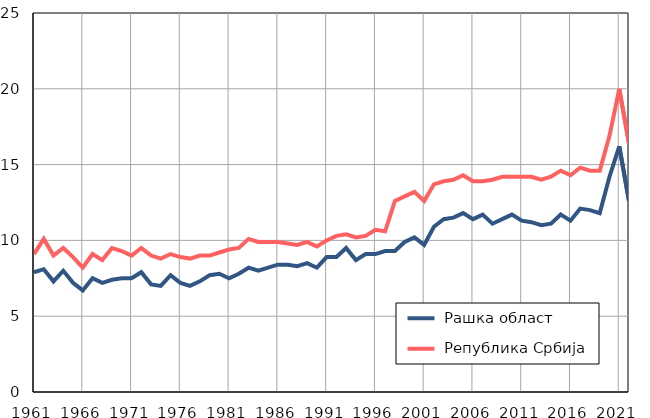
| Category |  Рашка област |  Република Србија |
|---|---|---|
| 1961.0 | 7.9 | 9.1 |
| 1962.0 | 8.1 | 10.1 |
| 1963.0 | 7.3 | 9 |
| 1964.0 | 8 | 9.5 |
| 1965.0 | 7.2 | 8.9 |
| 1966.0 | 6.7 | 8.2 |
| 1967.0 | 7.5 | 9.1 |
| 1968.0 | 7.2 | 8.7 |
| 1969.0 | 7.4 | 9.5 |
| 1970.0 | 7.5 | 9.3 |
| 1971.0 | 7.5 | 9 |
| 1972.0 | 7.9 | 9.5 |
| 1973.0 | 7.1 | 9 |
| 1974.0 | 7 | 8.8 |
| 1975.0 | 7.7 | 9.1 |
| 1976.0 | 7.2 | 8.9 |
| 1977.0 | 7 | 8.8 |
| 1978.0 | 7.3 | 9 |
| 1979.0 | 7.7 | 9 |
| 1980.0 | 7.8 | 9.2 |
| 1981.0 | 7.5 | 9.4 |
| 1982.0 | 7.8 | 9.5 |
| 1983.0 | 8.2 | 10.1 |
| 1984.0 | 8 | 9.9 |
| 1985.0 | 8.2 | 9.9 |
| 1986.0 | 8.4 | 9.9 |
| 1987.0 | 8.4 | 9.8 |
| 1988.0 | 8.3 | 9.7 |
| 1989.0 | 8.5 | 9.9 |
| 1990.0 | 8.2 | 9.6 |
| 1991.0 | 8.9 | 10 |
| 1992.0 | 8.9 | 10.3 |
| 1993.0 | 9.5 | 10.4 |
| 1994.0 | 8.7 | 10.2 |
| 1995.0 | 9.1 | 10.3 |
| 1996.0 | 9.1 | 10.7 |
| 1997.0 | 9.3 | 10.6 |
| 1998.0 | 9.3 | 12.6 |
| 1999.0 | 9.9 | 12.9 |
| 2000.0 | 10.2 | 13.2 |
| 2001.0 | 9.7 | 12.6 |
| 2002.0 | 10.9 | 13.7 |
| 2003.0 | 11.4 | 13.9 |
| 2004.0 | 11.5 | 14 |
| 2005.0 | 11.8 | 14.3 |
| 2006.0 | 11.4 | 13.9 |
| 2007.0 | 11.7 | 13.9 |
| 2008.0 | 11.1 | 14 |
| 2009.0 | 11.4 | 14.2 |
| 2010.0 | 11.7 | 14.2 |
| 2011.0 | 11.3 | 14.2 |
| 2012.0 | 11.2 | 14.2 |
| 2013.0 | 11 | 14 |
| 2014.0 | 11.1 | 14.2 |
| 2015.0 | 11.7 | 14.6 |
| 2016.0 | 11.3 | 14.3 |
| 2017.0 | 12.1 | 14.8 |
| 2018.0 | 12 | 14.6 |
| 2019.0 | 11.8 | 14.6 |
| 2020.0 | 14.2 | 16.9 |
| 2021.0 | 16.2 | 20 |
| 2022.0 | 12.6 | 16.4 |